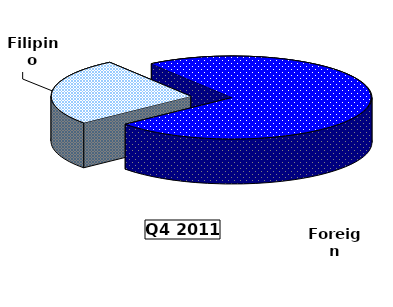
| Category | Series 0 |
|---|---|
| Filipino | 59.866 |
| Foreign | 167.918 |